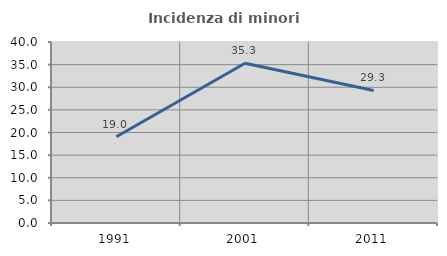
| Category | Incidenza di minori stranieri |
|---|---|
| 1991.0 | 19.048 |
| 2001.0 | 35.294 |
| 2011.0 | 29.298 |